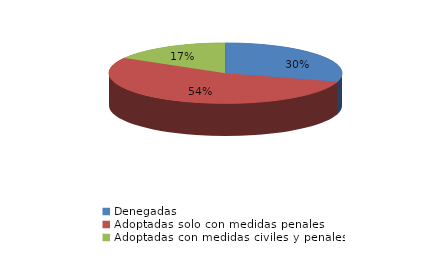
| Category | Series 0 |
|---|---|
| Denegadas | 32 |
| Adoptadas solo con medidas penales | 58 |
| Adoptadas con medidas civiles y penales | 18 |
| Adoptadas con medidas civiles | 0 |